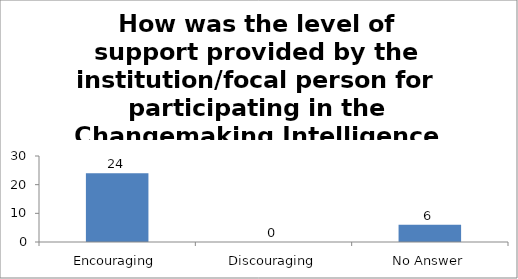
| Category | How was the level of support provided by the institution/focal person for participating in the Changemaking Intelligence Test? |
|---|---|
| Encouraging | 24 |
| Discouraging | 0 |
| No Answer | 6 |